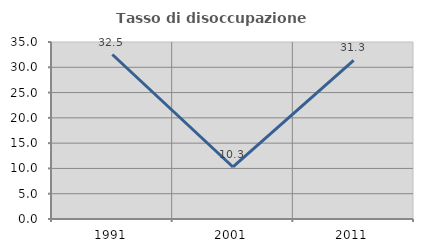
| Category | Tasso di disoccupazione giovanile  |
|---|---|
| 1991.0 | 32.523 |
| 2001.0 | 10.286 |
| 2011.0 | 31.343 |